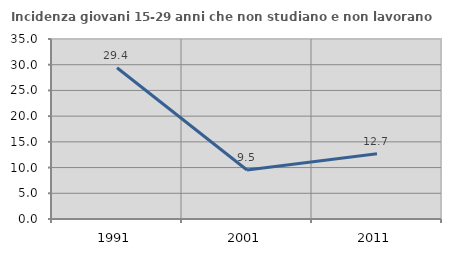
| Category | Incidenza giovani 15-29 anni che non studiano e non lavorano  |
|---|---|
| 1991.0 | 29.399 |
| 2001.0 | 9.535 |
| 2011.0 | 12.67 |